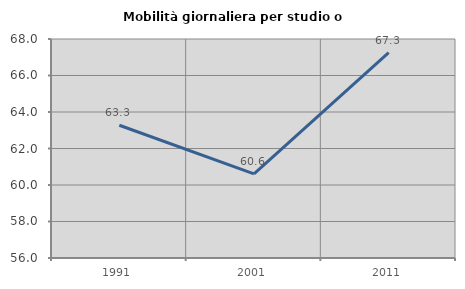
| Category | Mobilità giornaliera per studio o lavoro |
|---|---|
| 1991.0 | 63.275 |
| 2001.0 | 60.614 |
| 2011.0 | 67.259 |